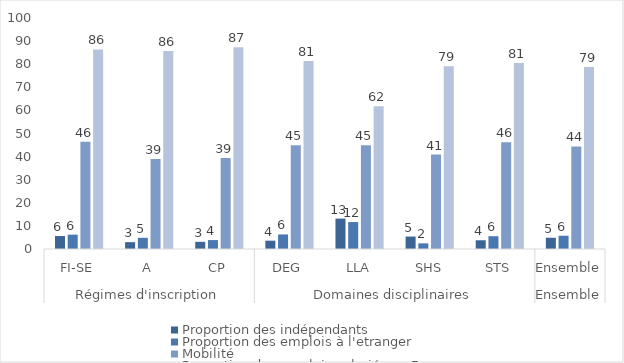
| Category | Proportion des indépendants | Proportion des emplois à l'etranger | Mobilité | Proportion des emplois salariés en France |
|---|---|---|---|---|
| 0 | 5.61 | 6.21 | 46.45 | 86.41 |
| 1 | 2.97 | 4.84 | 38.97 | 85.73 |
| 2 | 3.11 | 3.86 | 39.37 | 87.37 |
| 3 | 3.6 | 6.3 | 44.88 | 81.36 |
| 4 | 13.15 | 11.66 | 44.92 | 61.81 |
| 5 | 5.39 | 2.44 | 40.9 | 79.12 |
| 6 | 3.78 | 5.53 | 46.19 | 80.52 |
| 7 | 4.87 | 5.74 | 44.42 | 78.78 |